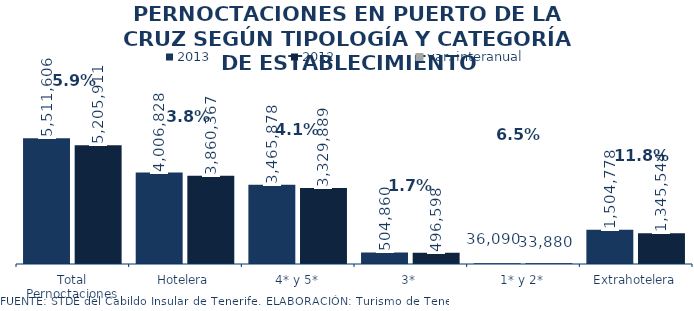
| Category | 2013 | 2012 |
|---|---|---|
| Total Pernoctaciones | 5511606 | 5205911 |
| Hotelera | 4006828 | 3860367 |
| 4* y 5* | 3465878 | 3329889 |
| 3* | 504860 | 496598 |
| 1* y 2* | 36090 | 33880 |
| Extrahotelera | 1504778 | 1345544 |